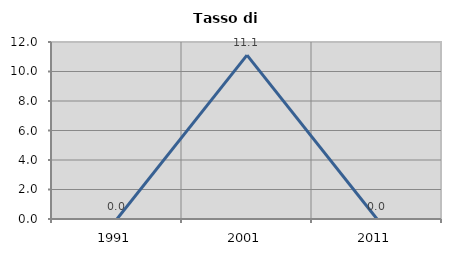
| Category | Tasso di disoccupazione   |
|---|---|
| 1991.0 | 0 |
| 2001.0 | 11.111 |
| 2011.0 | 0 |